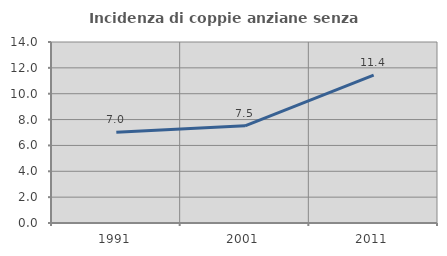
| Category | Incidenza di coppie anziane senza figli  |
|---|---|
| 1991.0 | 7.029 |
| 2001.0 | 7.52 |
| 2011.0 | 11.436 |